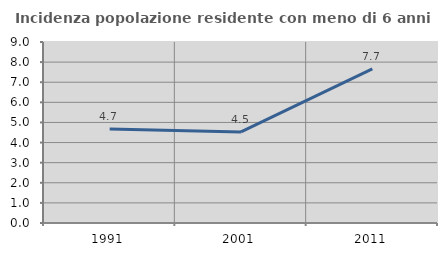
| Category | Incidenza popolazione residente con meno di 6 anni |
|---|---|
| 1991.0 | 4.675 |
| 2001.0 | 4.531 |
| 2011.0 | 7.66 |